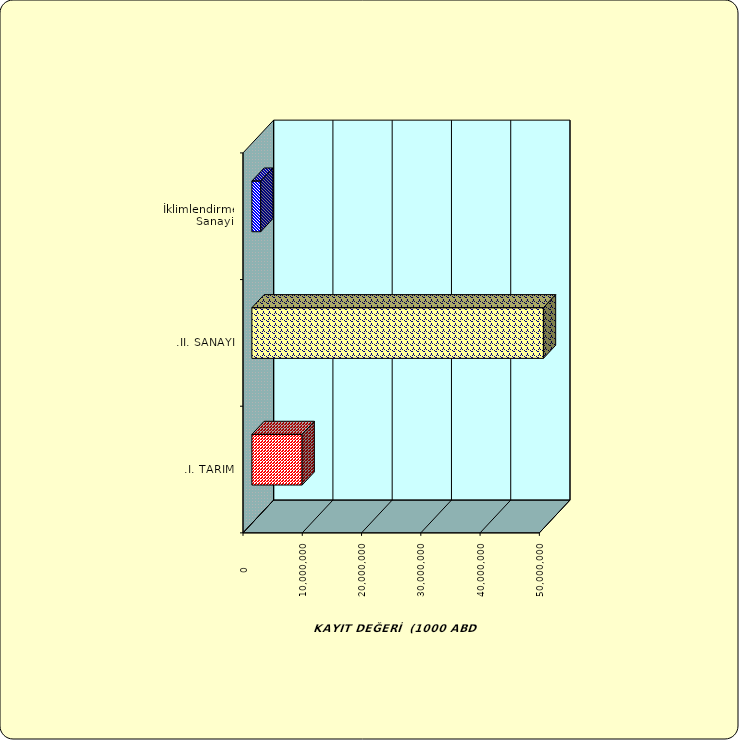
| Category | Series 0 |
|---|---|
| .I. TARIM | 8478741.458 |
| .II. SANAYİ | 49187585.443 |
|  İklimlendirme Sanayii | 1495924.798 |